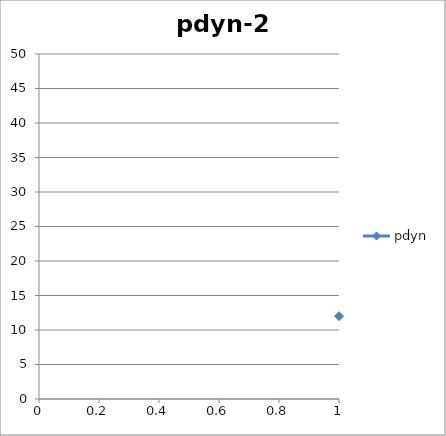
| Category | pdyn |
|---|---|
| 0 | 12 |
| 1 | 43 |
| 2 | 0 |
| 3 | 3 |
| 4 | 1 |
| 5 | 3 |
| 6 | 0 |
| 7 | 1 |
| 8 | 0 |
| 9 | 0 |
| 10 | 0 |